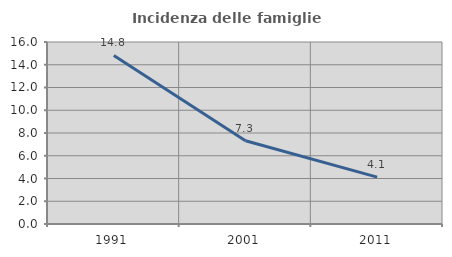
| Category | Incidenza delle famiglie numerose |
|---|---|
| 1991.0 | 14.818 |
| 2001.0 | 7.323 |
| 2011.0 | 4.124 |